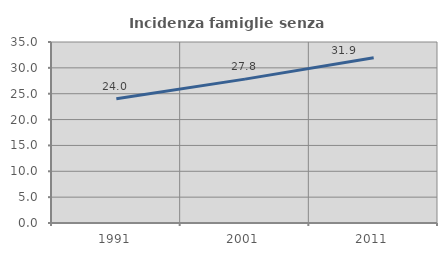
| Category | Incidenza famiglie senza nuclei |
|---|---|
| 1991.0 | 24.029 |
| 2001.0 | 27.819 |
| 2011.0 | 31.935 |